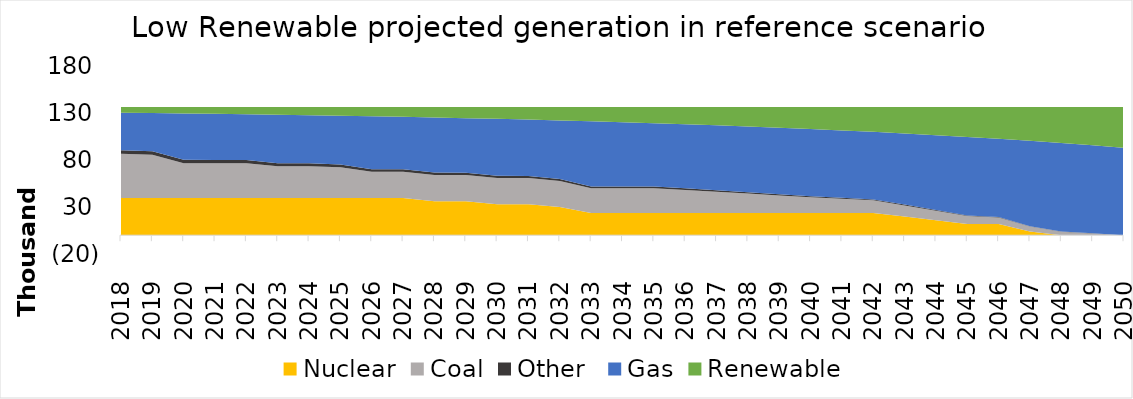
| Category | Nuclear | Coal | Other  | Gas | Renewable |
|---|---|---|---|---|---|
| 2018.0 | 39619.615 | 46981.414 | 3823.479 | 39909.675 | 5975.456 |
| 2019.0 | 39619.615 | 46088.838 | 3703.996 | 40540.354 | 6356.838 |
| 2020.0 | 39619.615 | 37025.025 | 3584.512 | 49317.928 | 6762.56 |
| 2021.0 | 39619.615 | 37025.025 | 3465.028 | 49005.794 | 7194.178 |
| 2022.0 | 39619.615 | 37025.025 | 3345.544 | 48666.113 | 7653.343 |
| 2023.0 | 39619.615 | 33742.025 | 3226.061 | 51580.125 | 8141.815 |
| 2024.0 | 39619.615 | 33742.025 | 3106.577 | 51179.96 | 8661.463 |
| 2025.0 | 39619.615 | 32618.344 | 2987.093 | 51870.311 | 9214.278 |
| 2026.0 | 39619.615 | 27782.455 | 2867.61 | 56237.586 | 9802.375 |
| 2027.0 | 39619.615 | 27782.455 | 2748.126 | 55731.437 | 10428.008 |
| 2028.0 | 36248.549 | 27782.455 | 2628.642 | 58556.423 | 11093.571 |
| 2029.0 | 36248.549 | 27782.455 | 2509.158 | 57967.864 | 11801.614 |
| 2030.0 | 32996.623 | 27782.455 | 2389.675 | 60586.039 | 12554.848 |
| 2031.0 | 32996.623 | 27782.455 | 2270.191 | 59904.215 | 13356.156 |
| 2032.0 | 29973.286 | 27782.455 | 2150.707 | 62194.585 | 14208.607 |
| 2033.0 | 23723.063 | 26185.776 | 2031.223 | 69254.112 | 15115.466 |
| 2034.0 | 23723.063 | 26185.776 | 1911.74 | 68408.857 | 16080.204 |
| 2035.0 | 23723.063 | 26185.776 | 1792.256 | 67502.028 | 17106.517 |
| 2036.0 | 23723.063 | 24474.517 | 1672.772 | 68240.954 | 18198.334 |
| 2037.0 | 23723.063 | 22508.52 | 1553.288 | 69164.934 | 19359.835 |
| 2038.0 | 23723.063 | 20542.522 | 1433.805 | 70014.781 | 20595.469 |
| 2039.0 | 23723.063 | 18576.525 | 1314.321 | 70785.765 | 21909.967 |
| 2040.0 | 23723.063 | 16610.527 | 1194.837 | 71472.851 | 23308.362 |
| 2041.0 | 23723.063 | 14993.898 | 1075.354 | 71721.317 | 24796.009 |
| 2042.0 | 23723.063 | 13377.269 | 955.87 | 71874.834 | 26378.604 |
| 2043.0 | 19958.228 | 11760.64 | 836.386 | 75692.178 | 28062.208 |
| 2044.0 | 15909.88 | 10144.011 | 716.902 | 79685.579 | 29853.267 |
| 2045.0 | 11924.13 | 8527.382 | 597.419 | 83502.068 | 31758.64 |
| 2046.0 | 11924.13 | 6910.753 | 477.935 | 83211.198 | 33785.623 |
| 2047.0 | 3840.358 | 5294.125 | 358.451 | 90874.73 | 35941.977 |
| 2048.0 | 0 | 3677.496 | 238.967 | 94157.218 | 38235.959 |
| 2049.0 | 0 | 1838.748 | 119.484 | 93675.054 | 40676.354 |
| 2050.0 | 0 | 0 | 0 | 93037.133 | 43272.507 |